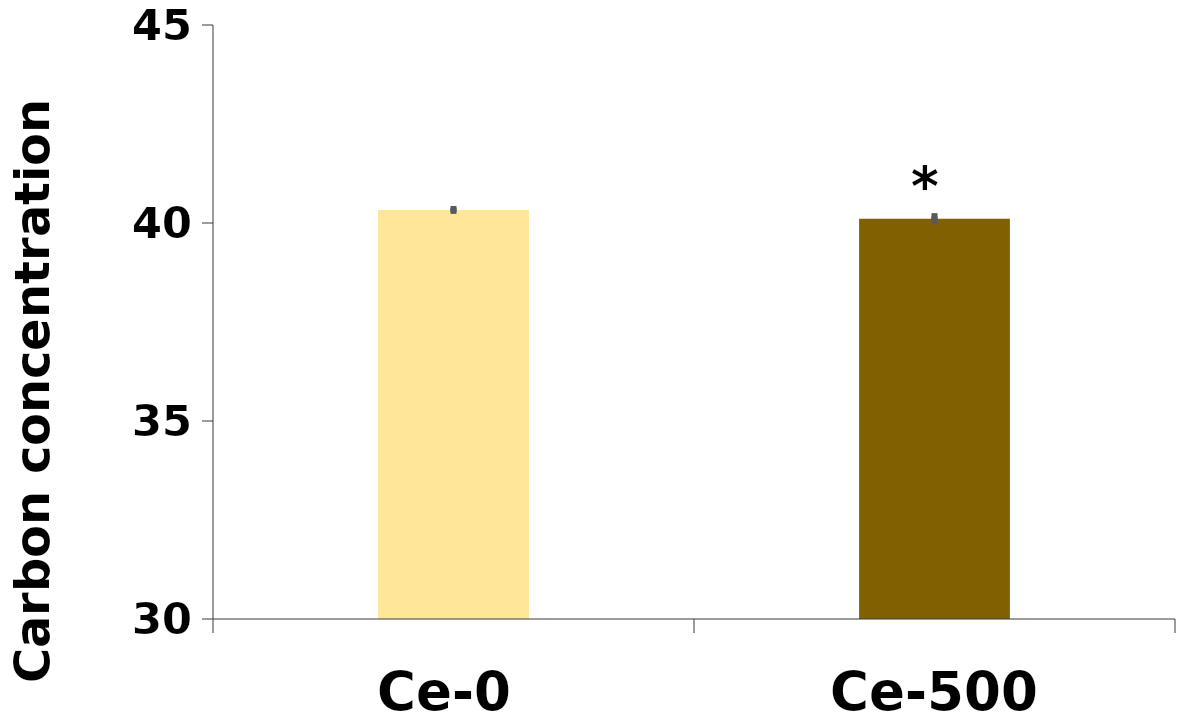
| Category | %C |
|---|---|
| Ce-0 | 40.33 |
| Ce-500 | 40.106 |